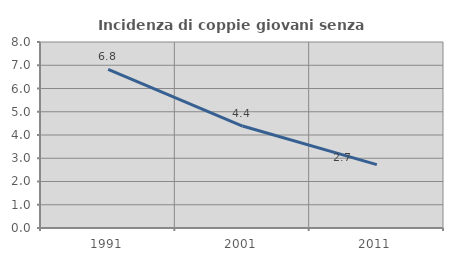
| Category | Incidenza di coppie giovani senza figli |
|---|---|
| 1991.0 | 6.818 |
| 2001.0 | 4.386 |
| 2011.0 | 2.727 |